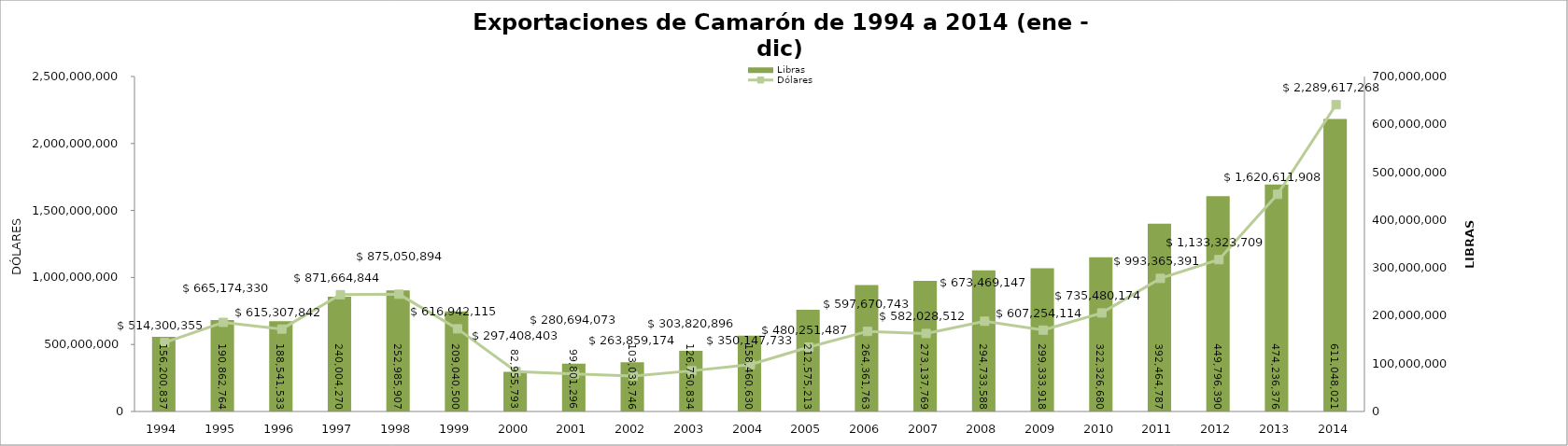
| Category | Libras |
|---|---|
| 1994.0 | 156200837 |
| 1995.0 | 190862764 |
| 1996.0 | 188541533 |
| 1997.0 | 240004270 |
| 1998.0 | 252985907 |
| 1999.0 | 209040500 |
| 2000.0 | 82955793 |
| 2001.0 | 99801296 |
| 2002.0 | 103033746 |
| 2003.0 | 126750834 |
| 2004.0 | 158460630 |
| 2005.0 | 212575213 |
| 2006.0 | 264361763 |
| 2007.0 | 273137769 |
| 2008.0 | 294733588 |
| 2009.0 | 299333918 |
| 2010.0 | 322326680 |
| 2011.0 | 392464787 |
| 2012.0 | 449796390 |
| 2013.0 | 474236376 |
| 2014.0 | 611048021 |